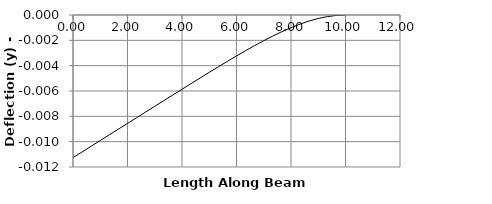
| Category | y |
|---|---|
| 0.0 | -0.011 |
| 0.3333333333333333 | -0.011 |
| 0.6666666666666666 | -0.01 |
| 1.0 | -0.01 |
| 1.3333333333333333 | -0.009 |
| 1.6666666666666665 | -0.009 |
| 2.0 | -0.009 |
| 2.0 | -0.009 |
| 2.333333333333333 | -0.008 |
| 2.6666666666666665 | -0.008 |
| 3.0 | -0.007 |
| 3.333333333333333 | -0.007 |
| 3.6666666666666665 | -0.006 |
| 4.0 | -0.006 |
| 4.333333333333333 | -0.005 |
| 4.666666666666666 | -0.005 |
| 5.0 | -0.005 |
| 5.333333333333333 | -0.004 |
| 5.666666666666666 | -0.004 |
| 6.0 | -0.003 |
| 6.333333333333333 | -0.003 |
| 6.666666666666666 | -0.002 |
| 7.0 | -0.002 |
| 7.333333333333333 | -0.002 |
| 7.666666666666666 | -0.001 |
| 8.0 | -0.001 |
| 8.0 | -0.001 |
| 8.333333333333332 | -0.001 |
| 8.666666666666666 | 0 |
| 9.0 | 0 |
| 9.333333333333332 | 0 |
| 9.666666666666666 | 0 |
| 10.0 | 0 |